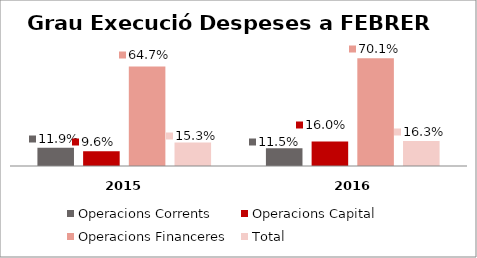
| Category | Operacions Corrents | Operacions Capital | Operacions Financeres | Total |
|---|---|---|---|---|
| 0 | 0.119 | 0.096 | 0.647 | 0.153 |
| 1 | 0.115 | 0.16 | 0.701 | 0.163 |